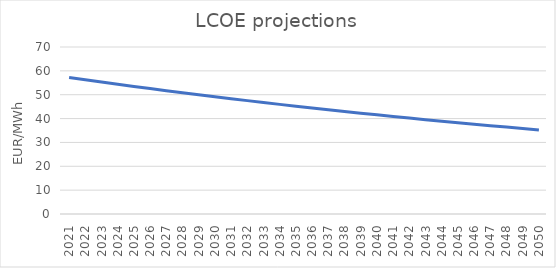
| Category | *Ren. Electricity Price |
|---|---|
| 2021.0 | 57.25 |
| 2022.0 | 56.282 |
| 2023.0 | 55.333 |
| 2024.0 | 54.4 |
| 2025.0 | 53.484 |
| 2026.0 | 52.585 |
| 2027.0 | 51.702 |
| 2028.0 | 50.835 |
| 2029.0 | 49.984 |
| 2030.0 | 49.148 |
| 2031.0 | 48.327 |
| 2032.0 | 47.521 |
| 2033.0 | 46.73 |
| 2034.0 | 45.952 |
| 2035.0 | 45.189 |
| 2036.0 | 44.44 |
| 2037.0 | 43.703 |
| 2038.0 | 42.98 |
| 2039.0 | 42.27 |
| 2040.0 | 41.573 |
| 2041.0 | 40.888 |
| 2042.0 | 40.216 |
| 2043.0 | 39.555 |
| 2044.0 | 38.906 |
| 2045.0 | 38.269 |
| 2046.0 | 37.643 |
| 2047.0 | 37.028 |
| 2048.0 | 36.425 |
| 2049.0 | 35.831 |
| 2050.0 | 35.249 |